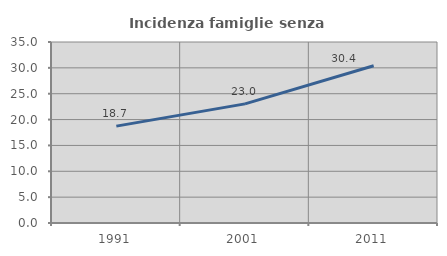
| Category | Incidenza famiglie senza nuclei |
|---|---|
| 1991.0 | 18.737 |
| 2001.0 | 23.034 |
| 2011.0 | 30.4 |